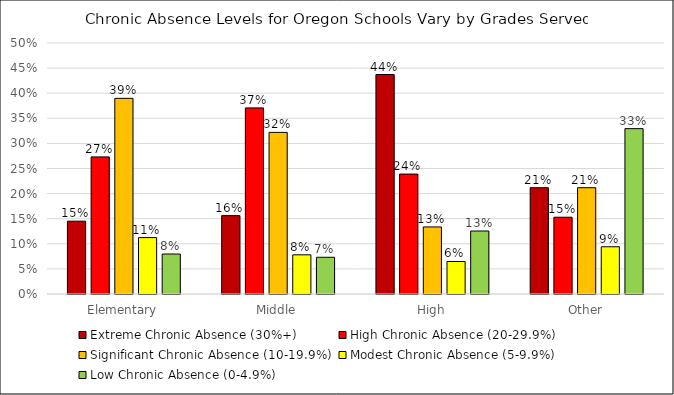
| Category | Extreme Chronic Absence (30%+) | High Chronic Absence (20-29.9%) | Significant Chronic Absence (10-19.9%) | Modest Chronic Absence (5-9.9%) | Low Chronic Absence (0-4.9%) |
|---|---|---|---|---|---|
| Elementary | 0.145 | 0.273 | 0.39 | 0.112 | 0.08 |
| Middle | 0.156 | 0.371 | 0.322 | 0.078 | 0.073 |
| High | 0.437 | 0.239 | 0.134 | 0.065 | 0.126 |
| Other | 0.212 | 0.153 | 0.212 | 0.094 | 0.329 |